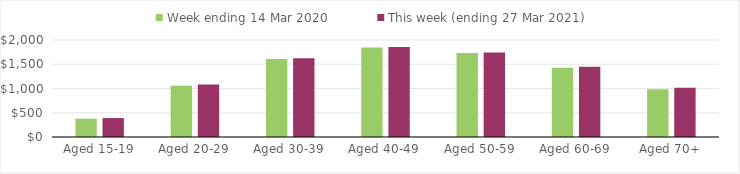
| Category | Week ending 14 Mar 2020 | This week (ending 27 Mar 2021) |
|---|---|---|
| Aged 15-19 | 378.61 | 390.36 |
| Aged 20-29 | 1056.3 | 1084.17 |
| Aged 30-39 | 1610.76 | 1626.26 |
| Aged 40-49 | 1846.97 | 1853.51 |
| Aged 50-59 | 1731.85 | 1742.27 |
| Aged 60-69 | 1428.68 | 1448.67 |
| Aged 70+ | 982.33 | 1015.55 |